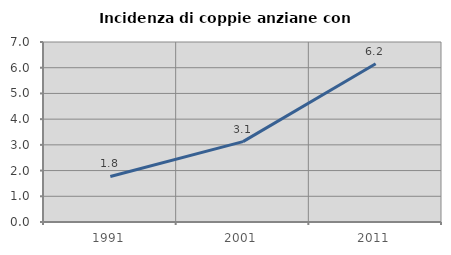
| Category | Incidenza di coppie anziane con figli |
|---|---|
| 1991.0 | 1.77 |
| 2001.0 | 3.125 |
| 2011.0 | 6.154 |